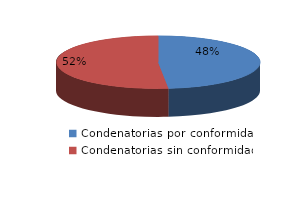
| Category | Series 0 |
|---|---|
| 0 | 15 |
| 1 | 16 |